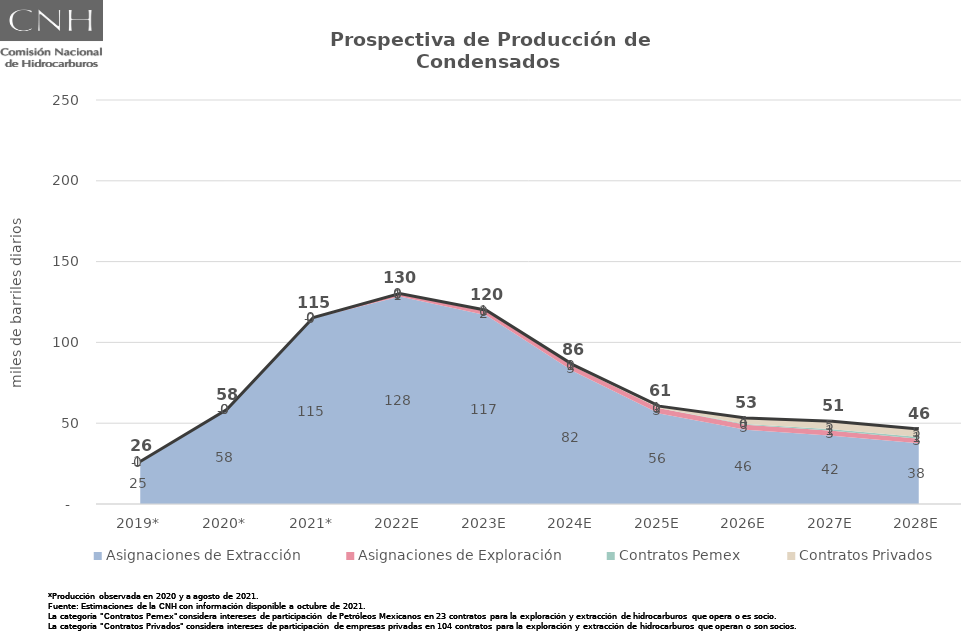
| Category | Total |
|---|---|
| 2019* | 26.35 |
| 2020* | 58.4 |
| 2021* | 115.364 |
| 2022E | 130.283 |
| 2023E | 119.938 |
| 2024E | 86.246 |
| 2025E | 60.571 |
| 2026E | 53.171 |
| 2027E | 51.203 |
| 2028E | 46.384 |